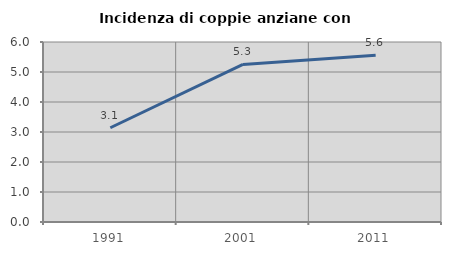
| Category | Incidenza di coppie anziane con figli |
|---|---|
| 1991.0 | 3.141 |
| 2001.0 | 5.253 |
| 2011.0 | 5.556 |